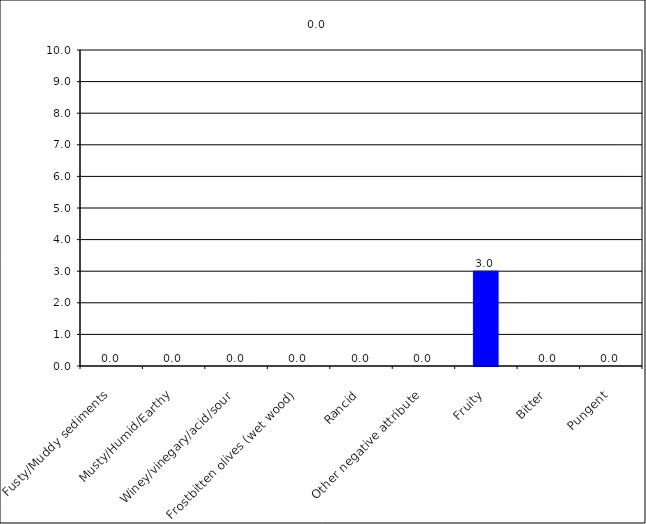
| Category | 0.0 |
|---|---|
| Fusty/Muddy sediments | 0 |
| Musty/Humid/Earthy | 0 |
| Winey/vinegary/acid/sour | 0 |
| Frostbitten olives (wet wood) | 0 |
| Rancid | 0 |
| Other negative attribute | 0 |
| Fruity | 3 |
| Bitter | 0 |
| Pungent | 0 |